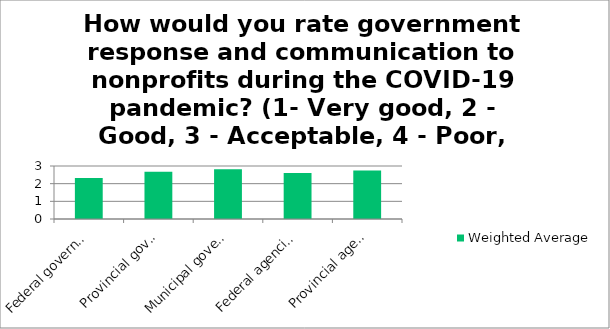
| Category | Weighted Average |
|---|---|
| Federal government response | 2.32 |
| Provincial government response | 2.67 |
| Municipal government response | 2.82 |
| Federal agencies | 2.61 |
| Provincial agencies | 2.75 |